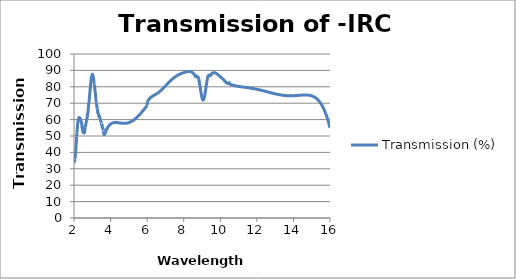
| Category | Transmission (%) |
|---|---|
| 2.00007 | 33.362 |
| 2.00994 | 34.442 |
| 2.0201 | 34.468 |
| 2.02997 | 33.964 |
| 2.03984 | 35.854 |
| 2.04998 | 36.923 |
| 2.05984 | 36.866 |
| 2.06999 | 37.706 |
| 2.07984 | 38.755 |
| 2.08997 | 40.522 |
| 2.09982 | 41.764 |
| 2.10995 | 43.55 |
| 2.11979 | 45.334 |
| 2.12991 | 46.979 |
| 2.14003 | 49.602 |
| 2.14986 | 49.66 |
| 2.15997 | 51.959 |
| 2.1698 | 53.281 |
| 2.1799 | 54.239 |
| 2.19 | 56.301 |
| 2.19982 | 57.288 |
| 2.20991 | 58.633 |
| 2.21972 | 59.163 |
| 2.22981 | 59.561 |
| 2.23989 | 60.382 |
| 2.24969 | 60.792 |
| 2.25977 | 60.902 |
| 2.26984 | 61.215 |
| 2.27991 | 60.998 |
| 2.2897 | 61.189 |
| 2.29976 | 61.078 |
| 2.30982 | 61.108 |
| 2.31987 | 61.001 |
| 2.32964 | 60.808 |
| 2.33969 | 60.277 |
| 2.34973 | 60.054 |
| 2.35977 | 59.723 |
| 2.36981 | 59.993 |
| 2.37984 | 59.08 |
| 2.38959 | 58.589 |
| 2.39962 | 58.701 |
| 2.40964 | 57.937 |
| 2.41965 | 57.37 |
| 2.42967 | 56.926 |
| 2.43968 | 55.337 |
| 2.44968 | 54.721 |
| 2.45968 | 53.983 |
| 2.46968 | 53.623 |
| 2.47968 | 53.2 |
| 2.48967 | 52.377 |
| 2.49965 | 52.15 |
| 2.50964 | 51.998 |
| 2.51961 | 52.14 |
| 2.52959 | 52.273 |
| 2.53956 | 51.817 |
| 2.54953 | 51.878 |
| 2.55949 | 52.609 |
| 2.56972 | 52.237 |
| 2.57968 | 52.279 |
| 2.58963 | 53.32 |
| 2.59957 | 54.187 |
| 2.60952 | 55.681 |
| 2.61945 | 56.246 |
| 2.62966 | 55.534 |
| 2.63959 | 56.807 |
| 2.64952 | 57.459 |
| 2.65944 | 58.04 |
| 2.66963 | 58.622 |
| 2.67954 | 59.03 |
| 2.68945 | 59.151 |
| 2.69963 | 60.197 |
| 2.70953 | 61.009 |
| 2.71943 | 61.143 |
| 2.72959 | 62.067 |
| 2.73948 | 63.148 |
| 2.74936 | 63.633 |
| 2.75951 | 64.134 |
| 2.76939 | 65.486 |
| 2.77953 | 66.292 |
| 2.78939 | 67.875 |
| 2.79953 | 68.937 |
| 2.80938 | 69.695 |
| 2.81951 | 70.999 |
| 2.82935 | 71.488 |
| 2.83947 | 72.994 |
| 2.84931 | 74.617 |
| 2.85941 | 75.331 |
| 2.86952 | 76.993 |
| 2.87934 | 78.312 |
| 2.88943 | 79.249 |
| 2.89925 | 80.191 |
| 2.90933 | 81.888 |
| 2.91941 | 82.671 |
| 2.92921 | 83.215 |
| 2.93927 | 84.093 |
| 2.94934 | 85.919 |
| 2.9594 | 85.574 |
| 2.96918 | 86.538 |
| 2.97923 | 87.034 |
| 2.98927 | 87.337 |
| 2.99931 | 87.672 |
| 3.00934 | 87.198 |
| 3.01937 | 87.406 |
| 3.02939 | 86.897 |
| 3.03914 | 86.992 |
| 3.04915 | 86.279 |
| 3.05916 | 85.568 |
| 3.06916 | 84.746 |
| 3.07916 | 84.303 |
| 3.08916 | 83.179 |
| 3.09914 | 82.403 |
| 3.10913 | 81.423 |
| 3.1191 | 81.371 |
| 3.12908 | 79.833 |
| 3.13931 | 78.593 |
| 3.14927 | 77.527 |
| 3.15923 | 77.003 |
| 3.16918 | 75.71 |
| 3.17913 | 74.438 |
| 3.18907 | 73.48 |
| 3.19927 | 72.096 |
| 3.2092 | 71.522 |
| 3.21912 | 70.859 |
| 3.22904 | 69.858 |
| 3.23922 | 69.837 |
| 3.24913 | 67.57 |
| 3.25904 | 67.972 |
| 3.2692 | 66.602 |
| 3.27909 | 65.634 |
| 3.28898 | 65.43 |
| 3.29913 | 65.027 |
| 3.309 | 63.574 |
| 3.31914 | 64.202 |
| 3.329 | 64.126 |
| 3.33912 | 62.582 |
| 3.34898 | 62.702 |
| 3.35909 | 62.481 |
| 3.36893 | 61.331 |
| 3.37903 | 62.672 |
| 3.38913 | 61.765 |
| 3.39895 | 61.749 |
| 3.40903 | 61.584 |
| 3.41911 | 61.644 |
| 3.42892 | 60.148 |
| 3.43898 | 59.851 |
| 3.44904 | 58.567 |
| 3.45883 | 58.941 |
| 3.46888 | 59.126 |
| 3.47892 | 58.71 |
| 3.48896 | 58.567 |
| 3.49899 | 57.565 |
| 3.50901 | 57.209 |
| 3.51903 | 56.746 |
| 3.52904 | 57.247 |
| 3.53878 | 56.068 |
| 3.54878 | 54.764 |
| 3.55877 | 55.649 |
| 3.56876 | 54.928 |
| 3.579 | 54.574 |
| 3.58897 | 54.778 |
| 3.59894 | 53.37 |
| 3.6089 | 52.532 |
| 3.61885 | 52.295 |
| 3.6288 | 52.542 |
| 3.63874 | 50.975 |
| 3.64894 | 51.995 |
| 3.65887 | 50.237 |
| 3.66879 | 50.59 |
| 3.6787 | 50.931 |
| 3.68887 | 51.27 |
| 3.69878 | 51.589 |
| 3.70867 | 51.897 |
| 3.71882 | 52.203 |
| 3.7287 | 52.49 |
| 3.73884 | 52.775 |
| 3.74871 | 53.042 |
| 3.75883 | 53.307 |
| 3.76869 | 53.555 |
| 3.7788 | 53.801 |
| 3.78864 | 54.032 |
| 3.79873 | 54.259 |
| 3.80882 | 54.478 |
| 3.81864 | 54.683 |
| 3.82872 | 54.885 |
| 3.83878 | 55.078 |
| 3.84859 | 55.259 |
| 3.85864 | 55.438 |
| 3.86868 | 55.608 |
| 3.87872 | 55.772 |
| 3.88875 | 55.928 |
| 3.89852 | 56.073 |
| 3.90854 | 56.216 |
| 3.91854 | 56.352 |
| 3.92855 | 56.481 |
| 3.93854 | 56.605 |
| 3.94853 | 56.722 |
| 3.95851 | 56.833 |
| 3.96848 | 56.939 |
| 3.9787 | 57.042 |
| 3.98866 | 57.137 |
| 3.99861 | 57.226 |
| 4.00856 | 57.311 |
| 4.01849 | 57.39 |
| 4.02867 | 57.467 |
| 4.0386 | 57.537 |
| 4.04851 | 57.603 |
| 4.05841 | 57.665 |
| 4.06857 | 57.724 |
| 4.07846 | 57.777 |
| 4.08859 | 57.828 |
| 4.09847 | 57.874 |
| 4.10859 | 57.918 |
| 4.11845 | 57.956 |
| 4.12855 | 57.993 |
| 4.1384 | 58.025 |
| 4.14849 | 58.055 |
| 4.15857 | 58.082 |
| 4.16839 | 58.105 |
| 4.17845 | 58.127 |
| 4.18851 | 58.145 |
| 4.19831 | 58.161 |
| 4.20835 | 58.175 |
| 4.21838 | 58.186 |
| 4.2284 | 58.195 |
| 4.23842 | 58.202 |
| 4.24842 | 58.207 |
| 4.25842 | 58.21 |
| 4.26841 | 58.212 |
| 4.2784 | 58.211 |
| 4.28837 | 58.209 |
| 4.29834 | 58.206 |
| 4.30829 | 58.201 |
| 4.31824 | 58.195 |
| 4.32843 | 58.187 |
| 4.33836 | 58.179 |
| 4.34829 | 58.169 |
| 4.3582 | 58.159 |
| 4.36836 | 58.147 |
| 4.37825 | 58.135 |
| 4.38839 | 58.122 |
| 4.39827 | 58.109 |
| 4.40839 | 58.094 |
| 4.41825 | 58.08 |
| 4.42835 | 58.064 |
| 4.4382 | 58.049 |
| 4.44828 | 58.033 |
| 4.45835 | 58.017 |
| 4.46817 | 58.001 |
| 4.47823 | 57.985 |
| 4.48828 | 57.969 |
| 4.49831 | 57.952 |
| 4.5081 | 57.936 |
| 4.51812 | 57.92 |
| 4.52813 | 57.905 |
| 4.53813 | 57.889 |
| 4.54812 | 57.874 |
| 4.5581 | 57.859 |
| 4.56807 | 57.845 |
| 4.57828 | 57.83 |
| 4.58823 | 57.817 |
| 4.59818 | 57.804 |
| 4.60811 | 57.792 |
| 4.61804 | 57.781 |
| 4.62819 | 57.77 |
| 4.6381 | 57.76 |
| 4.648 | 57.751 |
| 4.65812 | 57.742 |
| 4.668 | 57.735 |
| 4.67811 | 57.728 |
| 4.68797 | 57.722 |
| 4.69806 | 57.717 |
| 4.70813 | 57.714 |
| 4.71796 | 57.711 |
| 4.72802 | 57.709 |
| 4.73807 | 57.709 |
| 4.74811 | 57.71 |
| 4.75813 | 57.712 |
| 4.76791 | 57.715 |
| 4.77792 | 57.719 |
| 4.78792 | 57.724 |
| 4.79791 | 57.731 |
| 4.80788 | 57.739 |
| 4.81809 | 57.749 |
| 4.82804 | 57.76 |
| 4.83799 | 57.772 |
| 4.84792 | 57.785 |
| 4.85785 | 57.8 |
| 4.868 | 57.817 |
| 4.8779 | 57.835 |
| 4.88803 | 57.854 |
| 4.89791 | 57.875 |
| 4.90802 | 57.897 |
| 4.91788 | 57.921 |
| 4.92796 | 57.947 |
| 4.9378 | 57.973 |
| 4.94786 | 58.002 |
| 4.95792 | 58.032 |
| 4.96796 | 58.063 |
| 4.97799 | 58.097 |
| 4.98777 | 58.13 |
| 4.99778 | 58.167 |
| 5.00778 | 58.205 |
| 5.0176 | 58.243 |
| 5.02817 | 58.287 |
| 5.03799 | 58.329 |
| 5.0478 | 58.372 |
| 5.05762 | 58.417 |
| 5.06819 | 58.467 |
| 5.078 | 58.515 |
| 5.08781 | 58.565 |
| 5.09762 | 58.617 |
| 5.10743 | 58.669 |
| 5.11799 | 58.728 |
| 5.1278 | 58.784 |
| 5.13761 | 58.842 |
| 5.14741 | 58.901 |
| 5.15797 | 58.966 |
| 5.16777 | 59.029 |
| 5.17758 | 59.093 |
| 5.18738 | 59.158 |
| 5.19793 | 59.23 |
| 5.20773 | 59.299 |
| 5.21753 | 59.369 |
| 5.22732 | 59.44 |
| 5.23787 | 59.519 |
| 5.24767 | 59.594 |
| 5.25746 | 59.67 |
| 5.26801 | 59.753 |
| 5.2778 | 59.832 |
| 5.28759 | 59.913 |
| 5.29737 | 59.995 |
| 5.30792 | 60.085 |
| 5.3177 | 60.169 |
| 5.32749 | 60.256 |
| 5.33727 | 60.343 |
| 5.34781 | 60.439 |
| 5.35759 | 60.53 |
| 5.36737 | 60.622 |
| 5.3779 | 60.722 |
| 5.38768 | 60.816 |
| 5.39746 | 60.912 |
| 5.40724 | 61.009 |
| 5.41776 | 61.115 |
| 5.42754 | 61.215 |
| 5.43731 | 61.316 |
| 5.44783 | 61.426 |
| 5.4576 | 61.53 |
| 5.46737 | 61.634 |
| 5.47714 | 61.74 |
| 5.48766 | 61.856 |
| 5.49743 | 61.964 |
| 5.50719 | 62.073 |
| 5.51771 | 62.192 |
| 5.52747 | 62.304 |
| 5.53723 | 62.416 |
| 5.54774 | 62.539 |
| 5.5575 | 62.654 |
| 5.56726 | 62.77 |
| 5.57777 | 62.896 |
| 5.58752 | 63.013 |
| 5.59728 | 63.132 |
| 5.60778 | 63.261 |
| 5.61753 | 63.382 |
| 5.62728 | 63.504 |
| 5.63703 | 63.626 |
| 5.64753 | 63.759 |
| 5.65728 | 63.884 |
| 5.66702 | 64.009 |
| 5.67752 | 64.144 |
| 5.68726 | 64.271 |
| 5.69701 | 64.399 |
| 5.7075 | 64.537 |
| 5.71724 | 64.666 |
| 5.72698 | 64.795 |
| 5.73746 | 64.936 |
| 5.7472 | 65.067 |
| 5.75768 | 65.209 |
| 5.76742 | 65.341 |
| 5.77715 | 65.474 |
| 5.78763 | 65.618 |
| 5.79736 | 65.752 |
| 5.80709 | 65.887 |
| 5.81757 | 66.033 |
| 5.82729 | 66.168 |
| 5.83702 | 66.305 |
| 5.84749 | 66.452 |
| 5.85721 | 66.589 |
| 5.86693 | 66.727 |
| 5.8774 | 66.875 |
| 5.88712 | 67.013 |
| 5.89759 | 67.163 |
| 5.9073 | 67.302 |
| 5.91702 | 67.441 |
| 5.92748 | 67.592 |
| 5.93719 | 67.731 |
| 5.94691 | 67.872 |
| 5.95736 | 68.023 |
| 5.96707 | 68.163 |
| 5.97753 | 68.315 |
| 5.98723 | 68.456 |
| 5.99694 | 68.597 |
| 6.00739 | 70.729 |
| 6.01709 | 70.94 |
| 6.02679 | 71.142 |
| 6.03724 | 71.349 |
| 6.04694 | 71.532 |
| 6.05738 | 71.719 |
| 6.06708 | 71.885 |
| 6.07678 | 72.043 |
| 6.08722 | 72.205 |
| 6.09691 | 72.348 |
| 6.10734 | 72.495 |
| 6.11703 | 72.626 |
| 6.12672 | 72.75 |
| 6.13716 | 72.878 |
| 6.14684 | 72.992 |
| 6.15727 | 73.108 |
| 6.16696 | 73.212 |
| 6.17738 | 73.319 |
| 6.18706 | 73.414 |
| 6.19674 | 73.506 |
| 6.20717 | 73.601 |
| 6.21684 | 73.686 |
| 6.22726 | 73.774 |
| 6.23694 | 73.853 |
| 6.24661 | 73.929 |
| 6.25703 | 74.009 |
| 6.2667 | 74.081 |
| 6.27711 | 74.157 |
| 6.28678 | 74.225 |
| 6.29719 | 74.298 |
| 6.30685 | 74.363 |
| 6.31726 | 74.433 |
| 6.32692 | 74.496 |
| 6.33658 | 74.559 |
| 6.34698 | 74.626 |
| 6.35664 | 74.688 |
| 6.36704 | 74.754 |
| 6.3767 | 74.815 |
| 6.38709 | 74.88 |
| 6.39675 | 74.941 |
| 6.40714 | 75.007 |
| 6.41679 | 75.068 |
| 6.42718 | 75.134 |
| 6.43683 | 75.196 |
| 6.44647 | 75.259 |
| 6.45686 | 75.327 |
| 6.4665 | 75.39 |
| 6.47689 | 75.46 |
| 6.48653 | 75.525 |
| 6.49691 | 75.596 |
| 6.50655 | 75.663 |
| 6.51692 | 75.736 |
| 6.52656 | 75.805 |
| 6.53693 | 75.881 |
| 6.54657 | 75.952 |
| 6.55694 | 76.03 |
| 6.56657 | 76.103 |
| 6.57693 | 76.183 |
| 6.58656 | 76.259 |
| 6.59693 | 76.342 |
| 6.60655 | 76.42 |
| 6.61691 | 76.506 |
| 6.62653 | 76.587 |
| 6.63689 | 76.675 |
| 6.64651 | 76.758 |
| 6.65687 | 76.849 |
| 6.66648 | 76.935 |
| 6.67684 | 77.029 |
| 6.68645 | 77.117 |
| 6.6968 | 77.214 |
| 6.70641 | 77.305 |
| 6.71675 | 77.404 |
| 6.72636 | 77.497 |
| 6.7367 | 77.598 |
| 6.74631 | 77.694 |
| 6.75665 | 77.798 |
| 6.76625 | 77.896 |
| 6.77659 | 78.002 |
| 6.78692 | 78.109 |
| 6.79652 | 78.21 |
| 6.80685 | 78.32 |
| 6.81645 | 78.423 |
| 6.82678 | 78.534 |
| 6.83637 | 78.639 |
| 6.84669 | 78.752 |
| 6.85628 | 78.858 |
| 6.86661 | 78.973 |
| 6.87619 | 79.081 |
| 6.88651 | 79.197 |
| 6.89683 | 79.314 |
| 6.90641 | 79.424 |
| 6.91672 | 79.542 |
| 6.9263 | 79.653 |
| 6.93661 | 79.772 |
| 6.94619 | 79.884 |
| 6.9565 | 80.004 |
| 6.96681 | 80.125 |
| 6.97638 | 80.237 |
| 6.98668 | 80.358 |
| 6.99625 | 80.471 |
| 7.00655 | 80.592 |
| 7.01611 | 80.705 |
| 7.02641 | 80.827 |
| 7.03671 | 80.949 |
| 7.04626 | 81.062 |
| 7.05656 | 81.184 |
| 7.06611 | 81.297 |
| 7.0764 | 81.418 |
| 7.08669 | 81.539 |
| 7.09624 | 81.651 |
| 7.10653 | 81.772 |
| 7.11608 | 81.884 |
| 7.12636 | 82.004 |
| 7.13664 | 82.123 |
| 7.14618 | 82.234 |
| 7.15646 | 82.352 |
| 7.166 | 82.462 |
| 7.17627 | 82.579 |
| 7.18654 | 82.696 |
| 7.19608 | 82.804 |
| 7.20635 | 82.919 |
| 7.21661 | 83.034 |
| 7.22615 | 83.14 |
| 7.23641 | 83.253 |
| 7.24594 | 83.357 |
| 7.2562 | 83.469 |
| 7.26646 | 83.579 |
| 7.27598 | 83.681 |
| 7.28623 | 83.79 |
| 7.29649 | 83.898 |
| 7.30601 | 83.997 |
| 7.31626 | 84.103 |
| 7.3265 | 84.207 |
| 7.33602 | 84.304 |
| 7.34626 | 84.406 |
| 7.3565 | 84.508 |
| 7.36601 | 84.601 |
| 7.37625 | 84.701 |
| 7.38649 | 84.799 |
| 7.396 | 84.889 |
| 7.40623 | 84.985 |
| 7.41646 | 85.08 |
| 7.42596 | 85.167 |
| 7.43619 | 85.259 |
| 7.44642 | 85.351 |
| 7.45591 | 85.434 |
| 7.46614 | 85.523 |
| 7.47636 | 85.611 |
| 7.48585 | 85.691 |
| 7.49607 | 85.777 |
| 7.50628 | 85.861 |
| 7.51577 | 85.938 |
| 7.52598 | 86.019 |
| 7.53619 | 86.1 |
| 7.54568 | 86.173 |
| 7.55588 | 86.252 |
| 7.56609 | 86.328 |
| 7.57629 | 86.404 |
| 7.58577 | 86.473 |
| 7.59597 | 86.547 |
| 7.60617 | 86.619 |
| 7.61564 | 86.685 |
| 7.62583 | 86.755 |
| 7.63603 | 86.824 |
| 7.64622 | 86.892 |
| 7.65568 | 86.954 |
| 7.66587 | 87.019 |
| 7.67606 | 87.084 |
| 7.68624 | 87.147 |
| 7.6957 | 87.205 |
| 7.70588 | 87.267 |
| 7.71606 | 87.327 |
| 7.72623 | 87.387 |
| 7.73568 | 87.441 |
| 7.74586 | 87.499 |
| 7.75603 | 87.555 |
| 7.7662 | 87.611 |
| 7.77564 | 87.662 |
| 7.78581 | 87.716 |
| 7.79597 | 87.769 |
| 7.80614 | 87.821 |
| 7.81557 | 87.868 |
| 7.82573 | 87.919 |
| 7.83589 | 87.968 |
| 7.84604 | 88.017 |
| 7.85547 | 88.062 |
| 7.86562 | 88.109 |
| 7.87577 | 88.155 |
| 7.88592 | 88.201 |
| 7.89607 | 88.246 |
| 7.90549 | 88.287 |
| 7.91563 | 88.33 |
| 7.92577 | 88.373 |
| 7.93591 | 88.415 |
| 7.94605 | 88.456 |
| 7.95546 | 88.493 |
| 7.96559 | 88.533 |
| 7.97572 | 88.572 |
| 7.98585 | 88.61 |
| 7.99598 | 88.648 |
| 8.00538 | 88.682 |
| 8.01551 | 88.718 |
| 8.02563 | 88.753 |
| 8.03575 | 88.787 |
| 8.04587 | 88.821 |
| 8.05598 | 88.854 |
| 8.06538 | 88.883 |
| 8.07549 | 88.915 |
| 8.0856 | 88.945 |
| 8.09571 | 88.974 |
| 8.10582 | 89.002 |
| 8.11592 | 89.029 |
| 8.1253 | 89.054 |
| 8.1354 | 89.079 |
| 8.1455 | 89.103 |
| 8.1556 | 89.125 |
| 8.16569 | 89.147 |
| 8.17579 | 89.167 |
| 8.18588 | 89.186 |
| 8.19525 | 89.202 |
| 8.20534 | 89.218 |
| 8.21542 | 89.232 |
| 8.22551 | 89.244 |
| 8.23559 | 89.255 |
| 8.24567 | 89.264 |
| 8.25574 | 89.271 |
| 8.26582 | 89.276 |
| 8.27517 | 89.278 |
| 8.28525 | 89.279 |
| 8.29532 | 89.277 |
| 8.30538 | 89.273 |
| 8.31545 | 89.266 |
| 8.32552 | 89.256 |
| 8.33558 | 89.243 |
| 8.34564 | 89.227 |
| 8.3557 | 89.208 |
| 8.36575 | 89.185 |
| 8.37509 | 89.161 |
| 8.38514 | 89.132 |
| 8.39519 | 89.098 |
| 8.40524 | 89.06 |
| 8.41528 | 89.018 |
| 8.42533 | 88.972 |
| 8.43537 | 88.921 |
| 8.44541 | 88.864 |
| 8.45545 | 88.803 |
| 8.46549 | 88.736 |
| 8.47552 | 88.663 |
| 8.48555 | 88.585 |
| 8.49558 | 88.5 |
| 8.50561 | 88.409 |
| 8.51564 | 88.311 |
| 8.52566 | 88.206 |
| 8.53568 | 88.093 |
| 8.54499 | 87.982 |
| 8.555 | 87.854 |
| 8.56502 | 87.719 |
| 8.57503 | 87.574 |
| 8.58505 | 87.421 |
| 8.59506 | 87.258 |
| 8.60506 | 87.085 |
| 8.61507 | 86.903 |
| 8.62507 | 86.71 |
| 8.63508 | 86.506 |
| 8.64507 | 86.29 |
| 8.65507 | 86.063 |
| 8.66507 | 86.708 |
| 8.67506 | 86.463 |
| 8.68505 | 86.328 |
| 8.69504 | 86.271 |
| 8.70503 | 86.265 |
| 8.71501 | 86.286 |
| 8.725 | 86.313 |
| 8.73498 | 86.33 |
| 8.74496 | 86.323 |
| 8.75493 | 86.278 |
| 8.76491 | 86.188 |
| 8.77488 | 86.046 |
| 8.78485 | 85.847 |
| 8.79482 | 85.588 |
| 8.80479 | 85.269 |
| 8.81546 | 84.889 |
| 8.82542 | 84.417 |
| 8.83538 | 83.919 |
| 8.84534 | 83.371 |
| 8.8553 | 82.777 |
| 8.86525 | 82.143 |
| 8.8752 | 81.476 |
| 8.88515 | 80.783 |
| 8.8951 | 80.07 |
| 8.90504 | 79.347 |
| 8.91498 | 78.619 |
| 8.92493 | 77.896 |
| 8.93486 | 77.185 |
| 8.9448 | 76.494 |
| 8.95473 | 75.829 |
| 8.96538 | 75.198 |
| 8.97531 | 74.567 |
| 8.98523 | 74.027 |
| 8.99516 | 73.54 |
| 9.00508 | 73.111 |
| 9.015 | 72.744 |
| 9.02492 | 72.443 |
| 9.03484 | 72.212 |
| 9.04476 | 72.052 |
| 9.05467 | 71.966 |
| 9.06529 | 71.955 |
| 9.07519 | 72.026 |
| 9.0851 | 72.169 |
| 9.095 | 72.385 |
| 9.10491 | 72.672 |
| 9.11481 | 73.028 |
| 9.1247 | 73.448 |
| 9.1346 | 73.93 |
| 9.1452 | 74.467 |
| 9.15509 | 75.099 |
| 9.16498 | 75.735 |
| 9.17486 | 76.409 |
| 9.18475 | 77.115 |
| 9.19463 | 77.845 |
| 9.20451 | 78.592 |
| 9.21509 | 79.348 |
| 9.22497 | 80.159 |
| 9.23484 | 80.909 |
| 9.24471 | 81.645 |
| 9.25458 | 82.358 |
| 9.26515 | 83.042 |
| 9.27501 | 83.733 |
| 9.28487 | 84.334 |
| 9.29473 | 84.885 |
| 9.30459 | 85.381 |
| 9.31445 | 85.819 |
| 9.325 | 86.194 |
| 9.33485 | 86.526 |
| 9.3447 | 86.768 |
| 9.35455 | 86.947 |
| 9.36439 | 87.064 |
| 9.37494 | 87.123 |
| 9.38477 | 87.131 |
| 9.39461 | 87.094 |
| 9.40445 | 87.026 |
| 9.41498 | 86.941 |
| 9.42481 | 86.848 |
| 9.43464 | 86.78 |
| 9.44446 | 86.753 |
| 9.45499 | 86.794 |
| 9.46481 | 86.944 |
| 9.47463 | 87.221 |
| 9.48444 | 87.666 |
| 9.49496 | 87.321 |
| 9.50477 | 87.309 |
| 9.51458 | 87.8 |
| 9.52439 | 87.908 |
| 9.53489 | 88.016 |
| 9.54469 | 88.11 |
| 9.55449 | 88.196 |
| 9.56429 | 88.275 |
| 9.57479 | 88.35 |
| 9.58458 | 88.412 |
| 9.59437 | 88.466 |
| 9.60486 | 88.515 |
| 9.61464 | 88.553 |
| 9.62443 | 88.582 |
| 9.63421 | 88.603 |
| 9.64469 | 88.617 |
| 9.65446 | 88.623 |
| 9.66424 | 88.621 |
| 9.67471 | 88.612 |
| 9.68448 | 88.595 |
| 9.69424 | 88.573 |
| 9.70471 | 88.542 |
| 9.71447 | 88.506 |
| 9.72423 | 88.466 |
| 9.73468 | 88.416 |
| 9.74444 | 88.365 |
| 9.75419 | 88.309 |
| 9.76464 | 88.244 |
| 9.77439 | 88.18 |
| 9.78413 | 88.112 |
| 9.79457 | 88.036 |
| 9.80431 | 87.962 |
| 9.81475 | 87.879 |
| 9.82448 | 87.8 |
| 9.83422 | 87.718 |
| 9.84464 | 87.628 |
| 9.85437 | 87.543 |
| 9.8641 | 87.457 |
| 9.87452 | 87.363 |
| 9.88424 | 87.274 |
| 9.89465 | 87.178 |
| 9.90437 | 87.088 |
| 9.91408 | 86.997 |
| 9.92449 | 86.899 |
| 9.9342 | 86.808 |
| 9.9446 | 86.709 |
| 9.9543 | 86.617 |
| 9.96401 | 86.525 |
| 9.9744 | 86.426 |
| 9.9841 | 86.333 |
| 9.99448 | 86.234 |
| 10.00417 | 86.141 |
| 10.01456 | 86.041 |
| 10.02424 | 85.948 |
| 10.03393 | 85.854 |
| 10.0443 | 85.753 |
| 10.05398 | 85.658 |
| 10.06435 | 85.555 |
| 10.07403 | 85.459 |
| 10.08439 | 85.354 |
| 10.09406 | 85.256 |
| 10.10442 | 85.15 |
| 10.11408 | 85.049 |
| 10.12444 | 84.94 |
| 10.1341 | 84.836 |
| 10.14444 | 84.724 |
| 10.1541 | 84.618 |
| 10.16444 | 84.503 |
| 10.17409 | 84.394 |
| 10.18443 | 84.275 |
| 10.19407 | 84.163 |
| 10.2044 | 84.041 |
| 10.21404 | 83.926 |
| 10.22437 | 83.802 |
| 10.234 | 83.686 |
| 10.24432 | 83.56 |
| 10.25395 | 83.443 |
| 10.26427 | 83.317 |
| 10.27389 | 83.2 |
| 10.2842 | 83.076 |
| 10.29382 | 82.962 |
| 10.30413 | 82.842 |
| 10.31374 | 82.734 |
| 10.32404 | 82.622 |
| 10.33434 | 82.515 |
| 10.34394 | 82.421 |
| 10.35423 | 82.328 |
| 10.36383 | 82.25 |
| 10.37412 | 82.177 |
| 10.38372 | 82.12 |
| 10.39399 | 82.072 |
| 10.40427 | 82.041 |
| 10.41386 | 82.029 |
| 10.42413 | 82.036 |
| 10.43371 | 82.063 |
| 10.44398 | 82.117 |
| 10.45424 | 82.2 |
| 10.46382 | 82.306 |
| 10.47407 | 82.454 |
| 10.48365 | 82.626 |
| 10.4939 | 82.452 |
| 10.50415 | 82.124 |
| 10.51371 | 81.988 |
| 10.52395 | 81.845 |
| 10.53419 | 81.706 |
| 10.54375 | 81.665 |
| 10.55398 | 81.425 |
| 10.56421 | 81.388 |
| 10.57376 | 81.349 |
| 10.58398 | 81.314 |
| 10.59353 | 81.276 |
| 10.60375 | 81.24 |
| 10.61396 | 81.204 |
| 10.62418 | 81.171 |
| 10.63371 | 81.137 |
| 10.64392 | 81.103 |
| 10.65412 | 81.072 |
| 10.66365 | 81.04 |
| 10.67385 | 81.008 |
| 10.68404 | 80.979 |
| 10.69356 | 80.948 |
| 10.70375 | 80.918 |
| 10.71394 | 80.89 |
| 10.72345 | 80.861 |
| 10.73363 | 80.833 |
| 10.74381 | 80.805 |
| 10.75399 | 80.779 |
| 10.76348 | 80.752 |
| 10.77366 | 80.726 |
| 10.78382 | 80.7 |
| 10.79399 | 80.676 |
| 10.80347 | 80.651 |
| 10.81363 | 80.627 |
| 10.82379 | 80.603 |
| 10.83395 | 80.581 |
| 10.84342 | 80.557 |
| 10.85357 | 80.534 |
| 10.86371 | 80.512 |
| 10.87386 | 80.491 |
| 10.88332 | 80.469 |
| 10.89346 | 80.448 |
| 10.90359 | 80.427 |
| 10.91372 | 80.406 |
| 10.92385 | 80.387 |
| 10.9333 | 80.367 |
| 10.94342 | 80.347 |
| 10.95354 | 80.327 |
| 10.96365 | 80.308 |
| 10.97377 | 80.289 |
| 10.98388 | 80.272 |
| 10.99331 | 80.253 |
| 11.00341 | 80.235 |
| 11.01351 | 80.217 |
| 11.02361 | 80.199 |
| 11.03371 | 80.182 |
| 11.0438 | 80.165 |
| 11.05321 | 80.148 |
| 11.0633 | 80.131 |
| 11.07338 | 80.114 |
| 11.08346 | 80.098 |
| 11.09354 | 80.081 |
| 11.10361 | 80.065 |
| 11.11368 | 80.049 |
| 11.12375 | 80.034 |
| 11.13315 | 80.018 |
| 11.14321 | 80.002 |
| 11.15327 | 79.986 |
| 11.16332 | 79.971 |
| 11.17338 | 79.955 |
| 11.18342 | 79.94 |
| 11.19347 | 79.924 |
| 11.20351 | 79.909 |
| 11.21356 | 79.894 |
| 11.22359 | 79.879 |
| 11.23363 | 79.863 |
| 11.24366 | 79.848 |
| 11.25369 | 79.833 |
| 11.26371 | 79.819 |
| 11.27306 | 79.804 |
| 11.28308 | 79.789 |
| 11.2931 | 79.775 |
| 11.30311 | 79.76 |
| 11.31312 | 79.745 |
| 11.32313 | 79.73 |
| 11.33313 | 79.715 |
| 11.34313 | 79.7 |
| 11.35313 | 79.685 |
| 11.36312 | 79.67 |
| 11.37312 | 79.655 |
| 11.3831 | 79.64 |
| 11.39309 | 79.625 |
| 11.40307 | 79.61 |
| 11.41305 | 79.594 |
| 11.42302 | 79.579 |
| 11.433 | 79.564 |
| 11.44297 | 79.548 |
| 11.45293 | 79.532 |
| 11.46356 | 79.516 |
| 11.47352 | 79.501 |
| 11.48347 | 79.485 |
| 11.49343 | 79.469 |
| 11.50338 | 79.453 |
| 11.51333 | 79.437 |
| 11.52327 | 79.421 |
| 11.53321 | 79.405 |
| 11.54315 | 79.389 |
| 11.55308 | 79.373 |
| 11.56301 | 79.356 |
| 11.57294 | 79.339 |
| 11.58287 | 79.322 |
| 11.59345 | 79.305 |
| 11.60337 | 79.288 |
| 11.61328 | 79.271 |
| 11.62319 | 79.254 |
| 11.6331 | 79.236 |
| 11.64301 | 79.219 |
| 11.65291 | 79.201 |
| 11.66281 | 79.182 |
| 11.67336 | 79.164 |
| 11.68326 | 79.146 |
| 11.69315 | 79.128 |
| 11.70303 | 79.11 |
| 11.71292 | 79.091 |
| 11.7228 | 79.072 |
| 11.73333 | 79.053 |
| 11.7432 | 79.034 |
| 11.75307 | 79.015 |
| 11.76294 | 78.996 |
| 11.7728 | 78.975 |
| 11.78332 | 78.956 |
| 11.79318 | 78.936 |
| 11.80303 | 78.916 |
| 11.81288 | 78.896 |
| 11.82273 | 78.875 |
| 11.83323 | 78.854 |
| 11.84307 | 78.834 |
| 11.8529 | 78.813 |
| 11.86274 | 78.791 |
| 11.87322 | 78.77 |
| 11.88305 | 78.749 |
| 11.89288 | 78.728 |
| 11.9027 | 78.705 |
| 11.91317 | 78.684 |
| 11.92298 | 78.662 |
| 11.93279 | 78.64 |
| 11.9426 | 78.617 |
| 11.95306 | 78.594 |
| 11.96286 | 78.572 |
| 11.97265 | 78.548 |
| 11.9831 | 78.525 |
| 11.99289 | 78.503 |
| 12.00268 | 78.478 |
| 12.01311 | 78.455 |
| 12.02289 | 78.432 |
| 12.03267 | 78.407 |
| 12.0431 | 78.383 |
| 12.05287 | 78.359 |
| 12.06263 | 78.334 |
| 12.07305 | 78.31 |
| 12.08281 | 78.286 |
| 12.09257 | 78.26 |
| 12.10297 | 78.235 |
| 12.11272 | 78.211 |
| 12.12247 | 78.184 |
| 12.13286 | 78.16 |
| 12.1426 | 78.133 |
| 12.15298 | 78.108 |
| 12.16272 | 78.083 |
| 12.17245 | 78.055 |
| 12.18282 | 78.03 |
| 12.19254 | 78.003 |
| 12.20291 | 77.977 |
| 12.21263 | 77.949 |
| 12.22299 | 77.923 |
| 12.23269 | 77.897 |
| 12.2424 | 77.869 |
| 12.25275 | 77.843 |
| 12.26245 | 77.815 |
| 12.27279 | 77.788 |
| 12.28248 | 77.76 |
| 12.29281 | 77.733 |
| 12.3025 | 77.705 |
| 12.31282 | 77.678 |
| 12.3225 | 77.649 |
| 12.33282 | 77.622 |
| 12.34249 | 77.593 |
| 12.3528 | 77.566 |
| 12.36247 | 77.536 |
| 12.37277 | 77.509 |
| 12.38243 | 77.48 |
| 12.39272 | 77.452 |
| 12.40237 | 77.423 |
| 12.41266 | 77.395 |
| 12.42231 | 77.366 |
| 12.43259 | 77.338 |
| 12.44222 | 77.308 |
| 12.4525 | 77.278 |
| 12.46277 | 77.25 |
| 12.47239 | 77.221 |
| 12.48265 | 77.193 |
| 12.49227 | 77.163 |
| 12.50253 | 77.133 |
| 12.51278 | 77.105 |
| 12.52239 | 77.075 |
| 12.53263 | 77.047 |
| 12.54223 | 77.017 |
| 12.55247 | 76.987 |
| 12.5627 | 76.959 |
| 12.57229 | 76.929 |
| 12.58251 | 76.899 |
| 12.59273 | 76.87 |
| 12.60231 | 76.84 |
| 12.61252 | 76.812 |
| 12.62209 | 76.782 |
| 12.6323 | 76.753 |
| 12.6425 | 76.723 |
| 12.6527 | 76.695 |
| 12.66226 | 76.665 |
| 12.67245 | 76.635 |
| 12.68263 | 76.607 |
| 12.69218 | 76.577 |
| 12.70236 | 76.548 |
| 12.71253 | 76.52 |
| 12.72206 | 76.491 |
| 12.73223 | 76.461 |
| 12.74239 | 76.432 |
| 12.75255 | 76.404 |
| 12.76207 | 76.375 |
| 12.77222 | 76.346 |
| 12.78237 | 76.317 |
| 12.79251 | 76.29 |
| 12.80202 | 76.261 |
| 12.81215 | 76.232 |
| 12.82229 | 76.204 |
| 12.83241 | 76.175 |
| 12.84254 | 76.148 |
| 12.85202 | 76.12 |
| 12.86214 | 76.092 |
| 12.87225 | 76.064 |
| 12.88236 | 76.036 |
| 12.89246 | 76.01 |
| 12.90193 | 75.983 |
| 12.91203 | 75.955 |
| 12.92212 | 75.928 |
| 12.9322 | 75.901 |
| 12.94229 | 75.874 |
| 12.95237 | 75.847 |
| 12.96244 | 75.822 |
| 12.97189 | 75.796 |
| 12.98195 | 75.769 |
| 12.99202 | 75.743 |
| 13.00208 | 75.717 |
| 13.01213 | 75.692 |
| 13.02218 | 75.666 |
| 13.03223 | 75.641 |
| 13.04227 | 75.616 |
| 13.05231 | 75.591 |
| 13.06235 | 75.566 |
| 13.07238 | 75.543 |
| 13.08178 | 75.519 |
| 13.0918 | 75.495 |
| 13.10182 | 75.471 |
| 13.11184 | 75.448 |
| 13.12185 | 75.424 |
| 13.13185 | 75.401 |
| 13.14186 | 75.378 |
| 13.15186 | 75.356 |
| 13.16185 | 75.333 |
| 13.17184 | 75.311 |
| 13.18183 | 75.289 |
| 13.19181 | 75.268 |
| 13.20179 | 75.247 |
| 13.21176 | 75.226 |
| 13.22173 | 75.205 |
| 13.2317 | 75.184 |
| 13.24166 | 75.163 |
| 13.25224 | 75.143 |
| 13.26219 | 75.123 |
| 13.27214 | 75.104 |
| 13.28209 | 75.085 |
| 13.29203 | 75.066 |
| 13.30196 | 75.048 |
| 13.3119 | 75.03 |
| 13.32182 | 75.012 |
| 13.33175 | 74.994 |
| 13.34167 | 74.977 |
| 13.35158 | 74.959 |
| 13.36211 | 74.943 |
| 13.37202 | 74.926 |
| 13.38192 | 74.911 |
| 13.39182 | 74.895 |
| 13.40172 | 74.88 |
| 13.41161 | 74.864 |
| 13.42211 | 74.849 |
| 13.43199 | 74.835 |
| 13.44187 | 74.821 |
| 13.45174 | 74.807 |
| 13.46161 | 74.793 |
| 13.4721 | 74.78 |
| 13.48196 | 74.767 |
| 13.49181 | 74.755 |
| 13.50166 | 74.743 |
| 13.51151 | 74.731 |
| 13.52197 | 74.72 |
| 13.53181 | 74.709 |
| 13.54165 | 74.698 |
| 13.55148 | 74.687 |
| 13.56192 | 74.677 |
| 13.57174 | 74.668 |
| 13.58156 | 74.658 |
| 13.59198 | 74.649 |
| 13.60179 | 74.641 |
| 13.6116 | 74.633 |
| 13.6214 | 74.624 |
| 13.63181 | 74.617 |
| 13.6416 | 74.61 |
| 13.65139 | 74.603 |
| 13.66178 | 74.596 |
| 13.67156 | 74.59 |
| 13.68195 | 74.584 |
| 13.69172 | 74.579 |
| 13.70148 | 74.573 |
| 13.71185 | 74.569 |
| 13.72161 | 74.564 |
| 13.73136 | 74.56 |
| 13.74172 | 74.557 |
| 13.75146 | 74.553 |
| 13.76181 | 74.55 |
| 13.77155 | 74.547 |
| 13.78189 | 74.545 |
| 13.79161 | 74.543 |
| 13.80133 | 74.541 |
| 13.81166 | 74.54 |
| 13.82137 | 74.539 |
| 13.83169 | 74.538 |
| 13.84139 | 74.538 |
| 13.8517 | 74.538 |
| 13.86139 | 74.538 |
| 13.87169 | 74.539 |
| 13.88137 | 74.54 |
| 13.89166 | 74.541 |
| 13.90134 | 74.543 |
| 13.91162 | 74.545 |
| 13.92128 | 74.547 |
| 13.93155 | 74.549 |
| 13.94121 | 74.552 |
| 13.95147 | 74.555 |
| 13.96172 | 74.559 |
| 13.97137 | 74.562 |
| 13.98161 | 74.566 |
| 13.99125 | 74.57 |
| 14.00148 | 74.575 |
| 14.01171 | 74.58 |
| 14.02134 | 74.585 |
| 14.03156 | 74.59 |
| 14.04117 | 74.595 |
| 14.05138 | 74.601 |
| 14.06158 | 74.607 |
| 14.07118 | 74.613 |
| 14.08138 | 74.62 |
| 14.09157 | 74.626 |
| 14.10116 | 74.633 |
| 14.11134 | 74.64 |
| 14.12151 | 74.647 |
| 14.13109 | 74.654 |
| 14.14125 | 74.662 |
| 14.15142 | 74.67 |
| 14.16157 | 74.677 |
| 14.17113 | 74.685 |
| 14.18127 | 74.694 |
| 14.19141 | 74.702 |
| 14.20155 | 74.71 |
| 14.21109 | 74.719 |
| 14.22121 | 74.727 |
| 14.23134 | 74.736 |
| 14.24145 | 74.745 |
| 14.25097 | 74.754 |
| 14.26108 | 74.763 |
| 14.27118 | 74.772 |
| 14.28128 | 74.781 |
| 14.29137 | 74.79 |
| 14.30146 | 74.798 |
| 14.31095 | 74.807 |
| 14.32102 | 74.816 |
| 14.3311 | 74.826 |
| 14.34116 | 74.835 |
| 14.35123 | 74.844 |
| 14.36128 | 74.852 |
| 14.37134 | 74.861 |
| 14.38138 | 74.87 |
| 14.39142 | 74.878 |
| 14.40087 | 74.887 |
| 14.4109 | 74.895 |
| 14.42093 | 74.903 |
| 14.43095 | 74.911 |
| 14.44097 | 74.919 |
| 14.45098 | 74.927 |
| 14.46099 | 74.934 |
| 14.47099 | 74.941 |
| 14.48099 | 74.948 |
| 14.49098 | 74.955 |
| 14.50096 | 74.961 |
| 14.51095 | 74.968 |
| 14.52092 | 74.973 |
| 14.53089 | 74.979 |
| 14.54086 | 74.984 |
| 14.55082 | 74.989 |
| 14.56077 | 74.993 |
| 14.57131 | 74.997 |
| 14.58126 | 75.001 |
| 14.5912 | 75.004 |
| 14.60113 | 75.007 |
| 14.61106 | 75.009 |
| 14.62098 | 75.011 |
| 14.6309 | 75.012 |
| 14.64082 | 75.012 |
| 14.65073 | 75.013 |
| 14.66121 | 75.012 |
| 14.67111 | 75.011 |
| 14.68101 | 75.009 |
| 14.69089 | 75.007 |
| 14.70078 | 75.004 |
| 14.71065 | 75 |
| 14.72111 | 74.995 |
| 14.73098 | 74.99 |
| 14.74084 | 74.984 |
| 14.75069 | 74.977 |
| 14.76112 | 74.969 |
| 14.77097 | 74.961 |
| 14.78081 | 74.951 |
| 14.79065 | 74.94 |
| 14.80106 | 74.929 |
| 14.81088 | 74.917 |
| 14.8207 | 74.903 |
| 14.83109 | 74.889 |
| 14.8409 | 74.874 |
| 14.8507 | 74.857 |
| 14.86108 | 74.84 |
| 14.87087 | 74.822 |
| 14.88066 | 74.801 |
| 14.89102 | 74.781 |
| 14.90079 | 74.759 |
| 14.91057 | 74.735 |
| 14.92091 | 74.711 |
| 14.93067 | 74.684 |
| 14.941 | 74.657 |
| 14.95075 | 74.629 |
| 14.96049 | 74.598 |
| 14.9708 | 74.567 |
| 14.98054 | 74.533 |
| 14.99084 | 74.499 |
| 15.00056 | 74.462 |
| 15.01085 | 74.425 |
| 15.02056 | 74.384 |
| 15.03084 | 74.344 |
| 15.04054 | 74.3 |
| 15.05081 | 74.257 |
| 15.0605 | 74.21 |
| 15.07075 | 74.163 |
| 15.08043 | 74.112 |
| 15.09068 | 74.059 |
| 15.10091 | 74.007 |
| 15.11058 | 73.95 |
| 15.1208 | 73.894 |
| 15.13045 | 73.833 |
| 15.14067 | 73.77 |
| 15.15088 | 73.708 |
| 15.16051 | 73.64 |
| 15.17071 | 73.574 |
| 15.18033 | 73.503 |
| 15.19052 | 73.428 |
| 15.20069 | 73.356 |
| 15.2103 | 73.277 |
| 15.22047 | 73.196 |
| 15.23063 | 73.112 |
| 15.24079 | 73.03 |
| 15.25037 | 72.941 |
| 15.26051 | 72.85 |
| 15.27065 | 72.755 |
| 15.28078 | 72.664 |
| 15.29035 | 72.564 |
| 15.30046 | 72.462 |
| 15.31058 | 72.357 |
| 15.32069 | 72.255 |
| 15.33023 | 72.144 |
| 15.34032 | 72.03 |
| 15.35041 | 71.913 |
| 15.36049 | 71.793 |
| 15.37057 | 71.67 |
| 15.38064 | 71.543 |
| 15.39071 | 71.421 |
| 15.40021 | 71.288 |
| 15.41026 | 71.152 |
| 15.42031 | 71.013 |
| 15.43035 | 70.87 |
| 15.44039 | 70.724 |
| 15.45042 | 70.574 |
| 15.46044 | 70.421 |
| 15.47046 | 70.264 |
| 15.48047 | 70.103 |
| 15.49047 | 69.938 |
| 15.50047 | 69.77 |
| 15.51046 | 69.598 |
| 15.52045 | 69.422 |
| 15.53043 | 69.243 |
| 15.5404 | 69.059 |
| 15.55037 | 68.871 |
| 15.56033 | 68.679 |
| 15.57029 | 68.483 |
| 15.58024 | 68.282 |
| 15.59018 | 68.078 |
| 15.60012 | 67.869 |
| 15.61005 | 67.644 |
| 15.62052 | 67.426 |
| 15.63044 | 67.203 |
| 15.64036 | 66.976 |
| 15.65026 | 66.745 |
| 15.66016 | 66.508 |
| 15.67005 | 66.254 |
| 15.68049 | 66.008 |
| 15.69037 | 65.757 |
| 15.70025 | 65.501 |
| 15.71012 | 65.241 |
| 15.71998 | 64.96 |
| 15.73038 | 64.689 |
| 15.74023 | 64.413 |
| 15.75007 | 64.131 |
| 15.75991 | 63.829 |
| 15.77029 | 63.536 |
| 15.78011 | 63.239 |
| 15.78993 | 62.918 |
| 15.80029 | 62.61 |
| 15.81009 | 62.295 |
| 15.81989 | 61.957 |
| 15.83023 | 61.631 |
| 15.84002 | 61.28 |
| 15.85034 | 60.942 |
| 15.86011 | 60.598 |
| 15.86988 | 60.229 |
| 15.88018 | 59.872 |
| 15.88994 | 59.49 |
| 15.90023 | 59.121 |
| 15.90997 | 58.724 |
| 15.92024 | 58.343 |
| 15.92997 | 57.933 |
| 15.94023 | 57.538 |
| 15.94995 | 57.114 |
| 15.9602 | 56.706 |
| 15.9699 | 56.267 |
| 15.98013 | 55.845 |
| 15.98982 | 55.392 |
| 16.00004 | 55.26 |